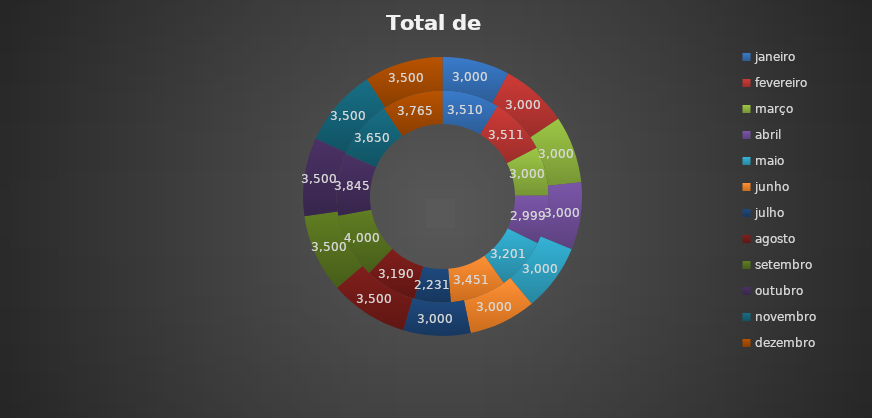
| Category | Series 0 | Meta |
|---|---|---|
| janeiro | 3510.4 | 3000 |
| fevereiro | 3510.7 | 3000 |
| março | 3000 | 3000 |
| abril | 2998.55 | 3000 |
| maio | 3200.65 | 3000 |
| junho | 3450.99 | 3000 |
| julho | 2230.99 | 3000 |
| agosto | 3190.45 | 3500 |
| setembro | 4000.05 | 3500 |
| outubro | 3845 | 3500 |
| novembro | 3650 | 3500 |
| dezembro | 3765.4 | 3500 |